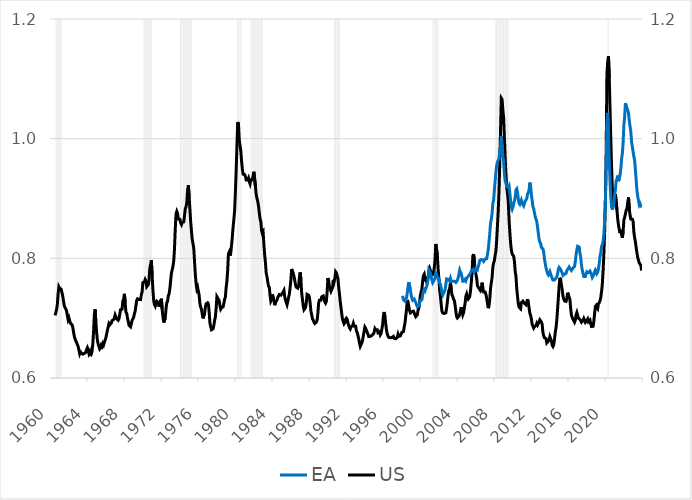
| Category | US recession indicator |
|---|---|
| 1960-07-01 | 1000 |
| 1960-08-01 | 1000 |
| 1960-09-01 | 1000 |
| 1960-10-01 | 1000 |
| 1960-11-01 | 1000 |
| 1960-12-01 | 1000 |
| 1961-01-01 | 1000 |
| 1961-02-01 | 1000 |
| 1961-03-01 | 0 |
| 1961-04-01 | 0 |
| 1961-05-01 | 0 |
| 1961-06-01 | 0 |
| 1961-07-01 | 0 |
| 1961-08-01 | 0 |
| 1961-09-01 | 0 |
| 1961-10-01 | 0 |
| 1961-11-01 | 0 |
| 1961-12-01 | 0 |
| 1962-01-01 | 0 |
| 1962-02-01 | 0 |
| 1962-03-01 | 0 |
| 1962-04-01 | 0 |
| 1962-05-01 | 0 |
| 1962-06-01 | 0 |
| 1962-07-01 | 0 |
| 1962-08-01 | 0 |
| 1962-09-01 | 0 |
| 1962-10-01 | 0 |
| 1962-11-01 | 0 |
| 1962-12-01 | 0 |
| 1963-01-01 | 0 |
| 1963-02-01 | 0 |
| 1963-03-01 | 0 |
| 1963-04-01 | 0 |
| 1963-05-01 | 0 |
| 1963-06-01 | 0 |
| 1963-07-01 | 0 |
| 1963-08-01 | 0 |
| 1963-09-01 | 0 |
| 1963-10-01 | 0 |
| 1963-11-01 | 0 |
| 1963-12-01 | 0 |
| 1964-01-01 | 0 |
| 1964-02-01 | 0 |
| 1964-03-01 | 0 |
| 1964-04-01 | 0 |
| 1964-05-01 | 0 |
| 1964-06-01 | 0 |
| 1964-07-01 | 0 |
| 1964-08-01 | 0 |
| 1964-09-01 | 0 |
| 1964-10-01 | 0 |
| 1964-11-01 | 0 |
| 1964-12-01 | 0 |
| 1965-01-01 | 0 |
| 1965-02-01 | 0 |
| 1965-03-01 | 0 |
| 1965-04-01 | 0 |
| 1965-05-01 | 0 |
| 1965-06-01 | 0 |
| 1965-07-01 | 0 |
| 1965-08-01 | 0 |
| 1965-09-01 | 0 |
| 1965-10-01 | 0 |
| 1965-11-01 | 0 |
| 1965-12-01 | 0 |
| 1966-01-01 | 0 |
| 1966-02-01 | 0 |
| 1966-03-01 | 0 |
| 1966-04-01 | 0 |
| 1966-05-01 | 0 |
| 1966-06-01 | 0 |
| 1966-07-01 | 0 |
| 1966-08-01 | 0 |
| 1966-09-01 | 0 |
| 1966-10-01 | 0 |
| 1966-11-01 | 0 |
| 1966-12-01 | 0 |
| 1967-01-01 | 0 |
| 1967-02-01 | 0 |
| 1967-03-01 | 0 |
| 1967-04-01 | 0 |
| 1967-05-01 | 0 |
| 1967-06-01 | 0 |
| 1967-07-01 | 0 |
| 1967-08-01 | 0 |
| 1967-09-01 | 0 |
| 1967-10-01 | 0 |
| 1967-11-01 | 0 |
| 1967-12-01 | 0 |
| 1968-01-01 | 0 |
| 1968-02-01 | 0 |
| 1968-03-01 | 0 |
| 1968-04-01 | 0 |
| 1968-05-01 | 0 |
| 1968-06-01 | 0 |
| 1968-07-01 | 0 |
| 1968-08-01 | 0 |
| 1968-09-01 | 0 |
| 1968-10-01 | 0 |
| 1968-11-01 | 0 |
| 1968-12-01 | 0 |
| 1969-01-01 | 0 |
| 1969-02-01 | 0 |
| 1969-03-01 | 0 |
| 1969-04-01 | 0 |
| 1969-05-01 | 0 |
| 1969-06-01 | 0 |
| 1969-07-01 | 0 |
| 1969-08-01 | 0 |
| 1969-09-01 | 0 |
| 1969-10-01 | 0 |
| 1969-11-01 | 0 |
| 1969-12-01 | 0 |
| 1970-01-01 | 1000 |
| 1970-02-01 | 1000 |
| 1970-03-01 | 1000 |
| 1970-04-01 | 1000 |
| 1970-05-01 | 1000 |
| 1970-06-01 | 1000 |
| 1970-07-01 | 1000 |
| 1970-08-01 | 1000 |
| 1970-09-01 | 1000 |
| 1970-10-01 | 1000 |
| 1970-11-01 | 1000 |
| 1970-12-01 | 0 |
| 1971-01-01 | 0 |
| 1971-02-01 | 0 |
| 1971-03-01 | 0 |
| 1971-04-01 | 0 |
| 1971-05-01 | 0 |
| 1971-06-01 | 0 |
| 1971-07-01 | 0 |
| 1971-08-01 | 0 |
| 1971-09-01 | 0 |
| 1971-10-01 | 0 |
| 1971-11-01 | 0 |
| 1971-12-01 | 0 |
| 1972-01-01 | 0 |
| 1972-02-01 | 0 |
| 1972-03-01 | 0 |
| 1972-04-01 | 0 |
| 1972-05-01 | 0 |
| 1972-06-01 | 0 |
| 1972-07-01 | 0 |
| 1972-08-01 | 0 |
| 1972-09-01 | 0 |
| 1972-10-01 | 0 |
| 1972-11-01 | 0 |
| 1972-12-01 | 0 |
| 1973-01-01 | 0 |
| 1973-02-01 | 0 |
| 1973-03-01 | 0 |
| 1973-04-01 | 0 |
| 1973-05-01 | 0 |
| 1973-06-01 | 0 |
| 1973-07-01 | 0 |
| 1973-08-01 | 0 |
| 1973-09-01 | 0 |
| 1973-10-01 | 0 |
| 1973-11-01 | 0 |
| 1973-12-01 | 1000 |
| 1974-01-01 | 1000 |
| 1974-02-01 | 1000 |
| 1974-03-01 | 1000 |
| 1974-04-01 | 1000 |
| 1974-05-01 | 1000 |
| 1974-06-01 | 1000 |
| 1974-07-01 | 1000 |
| 1974-08-01 | 1000 |
| 1974-09-01 | 1000 |
| 1974-10-01 | 1000 |
| 1974-11-01 | 1000 |
| 1974-12-01 | 1000 |
| 1975-01-01 | 1000 |
| 1975-02-01 | 1000 |
| 1975-03-01 | 1000 |
| 1975-04-01 | 0 |
| 1975-05-01 | 0 |
| 1975-06-01 | 0 |
| 1975-07-01 | 0 |
| 1975-08-01 | 0 |
| 1975-09-01 | 0 |
| 1975-10-01 | 0 |
| 1975-11-01 | 0 |
| 1975-12-01 | 0 |
| 1976-01-01 | 0 |
| 1976-02-01 | 0 |
| 1976-03-01 | 0 |
| 1976-04-01 | 0 |
| 1976-05-01 | 0 |
| 1976-06-01 | 0 |
| 1976-07-01 | 0 |
| 1976-08-01 | 0 |
| 1976-09-01 | 0 |
| 1976-10-01 | 0 |
| 1976-11-01 | 0 |
| 1976-12-01 | 0 |
| 1977-01-01 | 0 |
| 1977-02-01 | 0 |
| 1977-03-01 | 0 |
| 1977-04-01 | 0 |
| 1977-05-01 | 0 |
| 1977-06-01 | 0 |
| 1977-07-01 | 0 |
| 1977-08-01 | 0 |
| 1977-09-01 | 0 |
| 1977-10-01 | 0 |
| 1977-11-01 | 0 |
| 1977-12-01 | 0 |
| 1978-01-01 | 0 |
| 1978-02-01 | 0 |
| 1978-03-01 | 0 |
| 1978-04-01 | 0 |
| 1978-05-01 | 0 |
| 1978-06-01 | 0 |
| 1978-07-01 | 0 |
| 1978-08-01 | 0 |
| 1978-09-01 | 0 |
| 1978-10-01 | 0 |
| 1978-11-01 | 0 |
| 1978-12-01 | 0 |
| 1979-01-01 | 0 |
| 1979-02-01 | 0 |
| 1979-03-01 | 0 |
| 1979-04-01 | 0 |
| 1979-05-01 | 0 |
| 1979-06-01 | 0 |
| 1979-07-01 | 0 |
| 1979-08-01 | 0 |
| 1979-09-01 | 0 |
| 1979-10-01 | 0 |
| 1979-11-01 | 0 |
| 1979-12-01 | 0 |
| 1980-01-01 | 0 |
| 1980-02-01 | 1000 |
| 1980-03-01 | 1000 |
| 1980-04-01 | 1000 |
| 1980-05-01 | 1000 |
| 1980-06-01 | 1000 |
| 1980-07-01 | 1000 |
| 1980-08-01 | 0 |
| 1980-09-01 | 0 |
| 1980-10-01 | 0 |
| 1980-11-01 | 0 |
| 1980-12-01 | 0 |
| 1981-01-01 | 0 |
| 1981-02-01 | 0 |
| 1981-03-01 | 0 |
| 1981-04-01 | 0 |
| 1981-05-01 | 0 |
| 1981-06-01 | 0 |
| 1981-07-01 | 0 |
| 1981-08-01 | 1000 |
| 1981-09-01 | 1000 |
| 1981-10-01 | 1000 |
| 1981-11-01 | 1000 |
| 1981-12-01 | 1000 |
| 1982-01-01 | 1000 |
| 1982-02-01 | 1000 |
| 1982-03-01 | 1000 |
| 1982-04-01 | 1000 |
| 1982-05-01 | 1000 |
| 1982-06-01 | 1000 |
| 1982-07-01 | 1000 |
| 1982-08-01 | 1000 |
| 1982-09-01 | 1000 |
| 1982-10-01 | 1000 |
| 1982-11-01 | 1000 |
| 1982-12-01 | 0 |
| 1983-01-01 | 0 |
| 1983-02-01 | 0 |
| 1983-03-01 | 0 |
| 1983-04-01 | 0 |
| 1983-05-01 | 0 |
| 1983-06-01 | 0 |
| 1983-07-01 | 0 |
| 1983-08-01 | 0 |
| 1983-09-01 | 0 |
| 1983-10-01 | 0 |
| 1983-11-01 | 0 |
| 1983-12-01 | 0 |
| 1984-01-01 | 0 |
| 1984-02-01 | 0 |
| 1984-03-01 | 0 |
| 1984-04-01 | 0 |
| 1984-05-01 | 0 |
| 1984-06-01 | 0 |
| 1984-07-01 | 0 |
| 1984-08-01 | 0 |
| 1984-09-01 | 0 |
| 1984-10-01 | 0 |
| 1984-11-01 | 0 |
| 1984-12-01 | 0 |
| 1985-01-01 | 0 |
| 1985-02-01 | 0 |
| 1985-03-01 | 0 |
| 1985-04-01 | 0 |
| 1985-05-01 | 0 |
| 1985-06-01 | 0 |
| 1985-07-01 | 0 |
| 1985-08-01 | 0 |
| 1985-09-01 | 0 |
| 1985-10-01 | 0 |
| 1985-11-01 | 0 |
| 1985-12-01 | 0 |
| 1986-01-01 | 0 |
| 1986-02-01 | 0 |
| 1986-03-01 | 0 |
| 1986-04-01 | 0 |
| 1986-05-01 | 0 |
| 1986-06-01 | 0 |
| 1986-07-01 | 0 |
| 1986-08-01 | 0 |
| 1986-09-01 | 0 |
| 1986-10-01 | 0 |
| 1986-11-01 | 0 |
| 1986-12-01 | 0 |
| 1987-01-01 | 0 |
| 1987-02-01 | 0 |
| 1987-03-01 | 0 |
| 1987-04-01 | 0 |
| 1987-05-01 | 0 |
| 1987-06-01 | 0 |
| 1987-07-01 | 0 |
| 1987-08-01 | 0 |
| 1987-09-01 | 0 |
| 1987-10-01 | 0 |
| 1987-11-01 | 0 |
| 1987-12-01 | 0 |
| 1988-01-01 | 0 |
| 1988-02-01 | 0 |
| 1988-03-01 | 0 |
| 1988-04-01 | 0 |
| 1988-05-01 | 0 |
| 1988-06-01 | 0 |
| 1988-07-01 | 0 |
| 1988-08-01 | 0 |
| 1988-09-01 | 0 |
| 1988-10-01 | 0 |
| 1988-11-01 | 0 |
| 1988-12-01 | 0 |
| 1989-01-01 | 0 |
| 1989-02-01 | 0 |
| 1989-03-01 | 0 |
| 1989-04-01 | 0 |
| 1989-05-01 | 0 |
| 1989-06-01 | 0 |
| 1989-07-01 | 0 |
| 1989-08-01 | 0 |
| 1989-09-01 | 0 |
| 1989-10-01 | 0 |
| 1989-11-01 | 0 |
| 1989-12-01 | 0 |
| 1990-01-01 | 0 |
| 1990-02-01 | 0 |
| 1990-03-01 | 0 |
| 1990-04-01 | 0 |
| 1990-05-01 | 0 |
| 1990-06-01 | 0 |
| 1990-07-01 | 0 |
| 1990-08-01 | 1000 |
| 1990-09-01 | 1000 |
| 1990-10-01 | 1000 |
| 1990-11-01 | 1000 |
| 1990-12-01 | 1000 |
| 1991-01-01 | 1000 |
| 1991-02-01 | 1000 |
| 1991-03-01 | 1000 |
| 1991-04-01 | 0 |
| 1991-05-01 | 0 |
| 1991-06-01 | 0 |
| 1991-07-01 | 0 |
| 1991-08-01 | 0 |
| 1991-09-01 | 0 |
| 1991-10-01 | 0 |
| 1991-11-01 | 0 |
| 1991-12-01 | 0 |
| 1992-01-01 | 0 |
| 1992-02-01 | 0 |
| 1992-03-01 | 0 |
| 1992-04-01 | 0 |
| 1992-05-01 | 0 |
| 1992-06-01 | 0 |
| 1992-07-01 | 0 |
| 1992-08-01 | 0 |
| 1992-09-01 | 0 |
| 1992-10-01 | 0 |
| 1992-11-01 | 0 |
| 1992-12-01 | 0 |
| 1993-01-01 | 0 |
| 1993-02-01 | 0 |
| 1993-03-01 | 0 |
| 1993-04-01 | 0 |
| 1993-05-01 | 0 |
| 1993-06-01 | 0 |
| 1993-07-01 | 0 |
| 1993-08-01 | 0 |
| 1993-09-01 | 0 |
| 1993-10-01 | 0 |
| 1993-11-01 | 0 |
| 1993-12-01 | 0 |
| 1994-01-01 | 0 |
| 1994-02-01 | 0 |
| 1994-03-01 | 0 |
| 1994-04-01 | 0 |
| 1994-05-01 | 0 |
| 1994-06-01 | 0 |
| 1994-07-01 | 0 |
| 1994-08-01 | 0 |
| 1994-09-01 | 0 |
| 1994-10-01 | 0 |
| 1994-11-01 | 0 |
| 1994-12-01 | 0 |
| 1995-01-01 | 0 |
| 1995-02-01 | 0 |
| 1995-03-01 | 0 |
| 1995-04-01 | 0 |
| 1995-05-01 | 0 |
| 1995-06-01 | 0 |
| 1995-07-01 | 0 |
| 1995-08-01 | 0 |
| 1995-09-01 | 0 |
| 1995-10-01 | 0 |
| 1995-11-01 | 0 |
| 1995-12-01 | 0 |
| 1996-01-01 | 0 |
| 1996-02-01 | 0 |
| 1996-03-01 | 0 |
| 1996-04-01 | 0 |
| 1996-05-01 | 0 |
| 1996-06-01 | 0 |
| 1996-07-01 | 0 |
| 1996-08-01 | 0 |
| 1996-09-01 | 0 |
| 1996-10-01 | 0 |
| 1996-11-01 | 0 |
| 1996-12-01 | 0 |
| 1997-01-01 | 0 |
| 1997-02-01 | 0 |
| 1997-03-01 | 0 |
| 1997-04-01 | 0 |
| 1997-05-01 | 0 |
| 1997-06-01 | 0 |
| 1997-07-01 | 0 |
| 1997-08-01 | 0 |
| 1997-09-01 | 0 |
| 1997-10-01 | 0 |
| 1997-11-01 | 0 |
| 1997-12-01 | 0 |
| 1998-01-01 | 0 |
| 1998-02-01 | 0 |
| 1998-03-01 | 0 |
| 1998-04-01 | 0 |
| 1998-05-01 | 0 |
| 1998-06-01 | 0 |
| 1998-07-01 | 0 |
| 1998-08-01 | 0 |
| 1998-09-01 | 0 |
| 1998-10-01 | 0 |
| 1998-11-01 | 0 |
| 1998-12-01 | 0 |
| 1999-01-01 | 0 |
| 1999-02-01 | 0 |
| 1999-03-01 | 0 |
| 1999-04-01 | 0 |
| 1999-05-01 | 0 |
| 1999-06-01 | 0 |
| 1999-07-01 | 0 |
| 1999-08-01 | 0 |
| 1999-09-01 | 0 |
| 1999-10-01 | 0 |
| 1999-11-01 | 0 |
| 1999-12-01 | 0 |
| 2000-01-01 | 0 |
| 2000-02-01 | 0 |
| 2000-03-01 | 0 |
| 2000-04-01 | 0 |
| 2000-05-01 | 0 |
| 2000-06-01 | 0 |
| 2000-07-01 | 0 |
| 2000-08-01 | 0 |
| 2000-09-01 | 0 |
| 2000-10-01 | 0 |
| 2000-11-01 | 0 |
| 2000-12-01 | 0 |
| 2001-01-01 | 0 |
| 2001-02-01 | 0 |
| 2001-03-01 | 0 |
| 2001-04-01 | 1000 |
| 2001-05-01 | 1000 |
| 2001-06-01 | 1000 |
| 2001-07-01 | 1000 |
| 2001-08-01 | 1000 |
| 2001-09-01 | 1000 |
| 2001-10-01 | 1000 |
| 2001-11-01 | 1000 |
| 2001-12-01 | 0 |
| 2002-01-01 | 0 |
| 2002-02-01 | 0 |
| 2002-03-01 | 0 |
| 2002-04-01 | 0 |
| 2002-05-01 | 0 |
| 2002-06-01 | 0 |
| 2002-07-01 | 0 |
| 2002-08-01 | 0 |
| 2002-09-01 | 0 |
| 2002-10-01 | 0 |
| 2002-11-01 | 0 |
| 2002-12-01 | 0 |
| 2003-01-01 | 0 |
| 2003-02-01 | 0 |
| 2003-03-01 | 0 |
| 2003-04-01 | 0 |
| 2003-05-01 | 0 |
| 2003-06-01 | 0 |
| 2003-07-01 | 0 |
| 2003-08-01 | 0 |
| 2003-09-01 | 0 |
| 2003-10-01 | 0 |
| 2003-11-01 | 0 |
| 2003-12-01 | 0 |
| 2004-01-01 | 0 |
| 2004-02-01 | 0 |
| 2004-03-01 | 0 |
| 2004-04-01 | 0 |
| 2004-05-01 | 0 |
| 2004-06-01 | 0 |
| 2004-07-01 | 0 |
| 2004-08-01 | 0 |
| 2004-09-01 | 0 |
| 2004-10-01 | 0 |
| 2004-11-01 | 0 |
| 2004-12-01 | 0 |
| 2005-01-01 | 0 |
| 2005-02-01 | 0 |
| 2005-03-01 | 0 |
| 2005-04-01 | 0 |
| 2005-05-01 | 0 |
| 2005-06-01 | 0 |
| 2005-07-01 | 0 |
| 2005-08-01 | 0 |
| 2005-09-01 | 0 |
| 2005-10-01 | 0 |
| 2005-11-01 | 0 |
| 2005-12-01 | 0 |
| 2006-01-01 | 0 |
| 2006-02-01 | 0 |
| 2006-03-01 | 0 |
| 2006-04-01 | 0 |
| 2006-05-01 | 0 |
| 2006-06-01 | 0 |
| 2006-07-01 | 0 |
| 2006-08-01 | 0 |
| 2006-09-01 | 0 |
| 2006-10-01 | 0 |
| 2006-11-01 | 0 |
| 2006-12-01 | 0 |
| 2007-01-01 | 0 |
| 2007-02-01 | 0 |
| 2007-03-01 | 0 |
| 2007-04-01 | 0 |
| 2007-05-01 | 0 |
| 2007-06-01 | 0 |
| 2007-07-01 | 0 |
| 2007-08-01 | 0 |
| 2007-09-01 | 0 |
| 2007-10-01 | 0 |
| 2007-11-01 | 0 |
| 2007-12-01 | 0 |
| 2008-01-01 | 1000 |
| 2008-02-01 | 1000 |
| 2008-03-01 | 1000 |
| 2008-04-01 | 1000 |
| 2008-05-01 | 1000 |
| 2008-06-01 | 1000 |
| 2008-07-01 | 1000 |
| 2008-08-01 | 1000 |
| 2008-09-01 | 1000 |
| 2008-10-01 | 1000 |
| 2008-11-01 | 1000 |
| 2008-12-01 | 1000 |
| 2009-01-01 | 1000 |
| 2009-02-01 | 1000 |
| 2009-03-01 | 1000 |
| 2009-04-01 | 1000 |
| 2009-05-01 | 1000 |
| 2009-06-01 | 1000 |
| 2009-07-01 | 0 |
| 2009-08-01 | 0 |
| 2009-09-01 | 0 |
| 2009-10-01 | 0 |
| 2009-11-01 | 0 |
| 2009-12-01 | 0 |
| 2010-01-01 | 0 |
| 2010-02-01 | 0 |
| 2010-03-01 | 0 |
| 2010-04-01 | 0 |
| 2010-05-01 | 0 |
| 2010-06-01 | 0 |
| 2010-07-01 | 0 |
| 2010-08-01 | 0 |
| 2010-09-01 | 0 |
| 2010-10-01 | 0 |
| 2010-11-01 | 0 |
| 2010-12-01 | 0 |
| 2011-01-01 | 0 |
| 2011-02-01 | 0 |
| 2011-03-01 | 0 |
| 2011-04-01 | 0 |
| 2011-05-01 | 0 |
| 2011-06-01 | 0 |
| 2011-07-01 | 0 |
| 2011-08-01 | 0 |
| 2011-09-01 | 0 |
| 2011-10-01 | 0 |
| 2011-11-01 | 0 |
| 2011-12-01 | 0 |
| 2012-01-01 | 0 |
| 2012-02-01 | 0 |
| 2012-03-01 | 0 |
| 2012-04-01 | 0 |
| 2012-05-01 | 0 |
| 2012-06-01 | 0 |
| 2012-07-01 | 0 |
| 2012-08-01 | 0 |
| 2012-09-01 | 0 |
| 2012-10-01 | 0 |
| 2012-11-01 | 0 |
| 2012-12-01 | 0 |
| 2013-01-01 | 0 |
| 2013-02-01 | 0 |
| 2013-03-01 | 0 |
| 2013-04-01 | 0 |
| 2013-05-01 | 0 |
| 2013-06-01 | 0 |
| 2013-07-01 | 0 |
| 2013-08-01 | 0 |
| 2013-09-01 | 0 |
| 2013-10-01 | 0 |
| 2013-11-01 | 0 |
| 2013-12-01 | 0 |
| 2014-01-01 | 0 |
| 2014-02-01 | 0 |
| 2014-03-01 | 0 |
| 2014-04-01 | 0 |
| 2014-05-01 | 0 |
| 2014-06-01 | 0 |
| 2014-07-01 | 0 |
| 2014-08-01 | 0 |
| 2014-09-01 | 0 |
| 2014-10-01 | 0 |
| 2014-11-01 | 0 |
| 2014-12-01 | 0 |
| 2015-01-01 | 0 |
| 2015-02-01 | 0 |
| 2015-03-01 | 0 |
| 2015-04-01 | 0 |
| 2015-05-01 | 0 |
| 2015-06-01 | 0 |
| 2015-07-01 | 0 |
| 2015-08-01 | 0 |
| 2015-09-01 | 0 |
| 2015-10-01 | 0 |
| 2015-11-01 | 0 |
| 2015-12-01 | 0 |
| 2016-01-01 | 0 |
| 2016-02-01 | 0 |
| 2016-03-01 | 0 |
| 2016-04-01 | 0 |
| 2016-05-01 | 0 |
| 2016-06-01 | 0 |
| 2016-07-01 | 0 |
| 2016-08-01 | 0 |
| 2016-09-01 | 0 |
| 2016-10-01 | 0 |
| 2016-11-01 | 0 |
| 2016-12-01 | 0 |
| 2017-01-01 | 0 |
| 2017-02-01 | 0 |
| 2017-03-01 | 0 |
| 2017-04-01 | 0 |
| 2017-05-01 | 0 |
| 2017-06-01 | 0 |
| 2017-07-01 | 0 |
| 2017-08-01 | 0 |
| 2017-09-01 | 0 |
| 2017-10-01 | 0 |
| 2017-11-01 | 0 |
| 2017-12-01 | 0 |
| 2018-01-01 | 0 |
| 2018-02-01 | 0 |
| 2018-03-01 | 0 |
| 2018-04-01 | 0 |
| 2018-05-01 | 0 |
| 2018-06-01 | 0 |
| 2018-07-01 | 0 |
| 2018-08-01 | 0 |
| 2018-09-01 | 0 |
| 2018-10-01 | 0 |
| 2018-11-01 | 0 |
| 2018-12-01 | 0 |
| 2019-01-01 | 0 |
| 2019-02-01 | 0 |
| 2019-03-01 | 0 |
| 2019-04-01 | 0 |
| 2019-05-01 | 0 |
| 2019-06-01 | 0 |
| 2019-07-01 | 0 |
| 2019-08-01 | 0 |
| 2019-09-01 | 0 |
| 2019-10-01 | 0 |
| 2019-11-01 | 0 |
| 2019-12-01 | 0 |
| 2020-01-01 | 0 |
| 2020-02-01 | 0 |
| 2020-03-01 | 1000 |
| 2020-04-01 | 1000 |
| 2020-05-01 | 0 |
| 2020-06-01 | 0 |
| 2020-07-01 | 0 |
| 2020-08-01 | 0 |
| 2020-09-01 | 0 |
| 2020-10-01 | 0 |
| 2020-11-01 | 0 |
| 2020-12-01 | 0 |
| 2021-01-01 | 0 |
| 2021-02-01 | 0 |
| 2021-03-01 | 0 |
| 2021-04-01 | 0 |
| 2021-05-01 | 0 |
| 2021-06-01 | 0 |
| 2021-07-01 | 0 |
| 2021-08-01 | 0 |
| 2021-09-01 | 0 |
| 2021-10-01 | 0 |
| 2021-11-01 | 0 |
| 2021-12-01 | 0 |
| 2022-01-01 | 0 |
| 2022-02-01 | 0 |
| 2022-03-01 | 0 |
| 2022-04-01 | 0 |
| 2022-05-01 | 0 |
| 2022-06-01 | 0 |
| 2022-07-01 | 0 |
| 2022-08-01 | 0 |
| 2022-09-01 | 0 |
| 2022-10-01 | 0 |
| 2022-11-01 | 0 |
| 2022-12-01 | 0 |
| 2023-01-01 | 0 |
| 2023-02-01 | 0 |
| 2023-03-01 | 0 |
| 2023-04-01 | 0 |
| 2023-05-01 | 0 |
| 2023-06-01 | 0 |
| 2023-07-01 | 0 |
| 2023-08-01 | 0 |
| 2023-09-01 | 0 |
| 2023-10-01 | 0 |
| 2023-11-01 | 0 |
| 2023-12-01 | 0 |